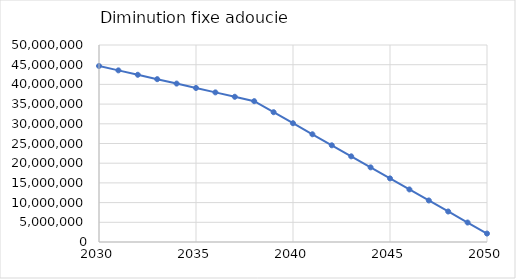
| Category | Diminution fixe adoucie |
|---|---|
| 2030.0 | 44677380 |
| 2031.0 | 43560445.5 |
| 2032.0 | 42443511 |
| 2033.0 | 41326576.5 |
| 2034.0 | 40209642 |
| 2035.0 | 39092707.5 |
| 2036.0 | 37975773 |
| 2037.0 | 36858838.5 |
| 2038.0 | 35741904 |
| 2039.0 | 32941978.667 |
| 2040.0 | 30142053.333 |
| 2041.0 | 27342128 |
| 2042.0 | 24542202.667 |
| 2043.0 | 21742277.333 |
| 2044.0 | 18942352 |
| 2045.0 | 16142426.667 |
| 2046.0 | 13342501.333 |
| 2047.0 | 10542576 |
| 2048.0 | 7742650.667 |
| 2049.0 | 4942725.333 |
| 2050.0 | 2142800 |